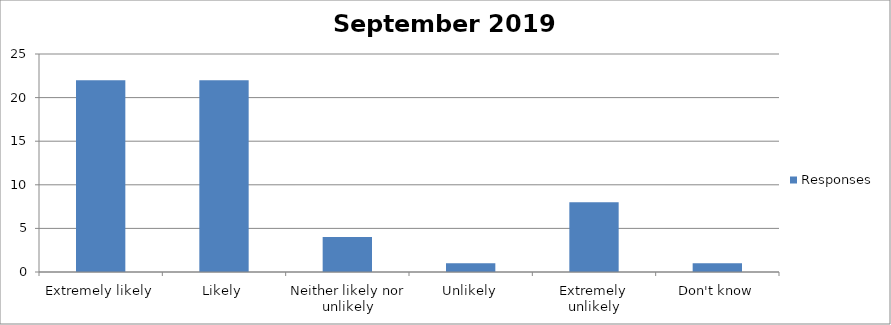
| Category | Responses |
|---|---|
| Extremely likely | 22 |
| Likely | 22 |
| Neither likely nor unlikely | 4 |
| Unlikely | 1 |
| Extremely unlikely | 8 |
| Don't know | 1 |